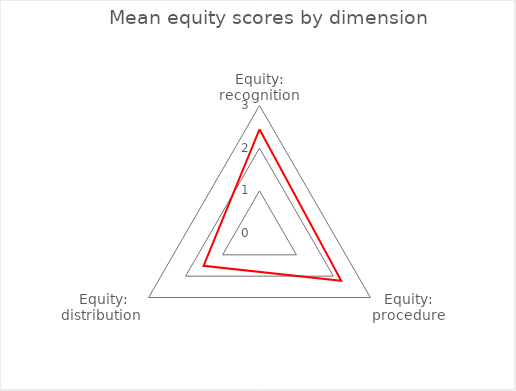
| Category | Mean |
|---|---|
| Equity: recognition | 2.443 |
| Equity: procedure | 2.212 |
| Equity: distribution  | 1.514 |